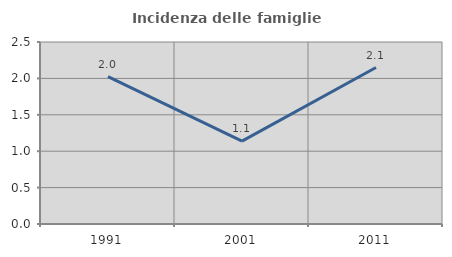
| Category | Incidenza delle famiglie numerose |
|---|---|
| 1991.0 | 2.024 |
| 2001.0 | 1.138 |
| 2011.0 | 2.149 |